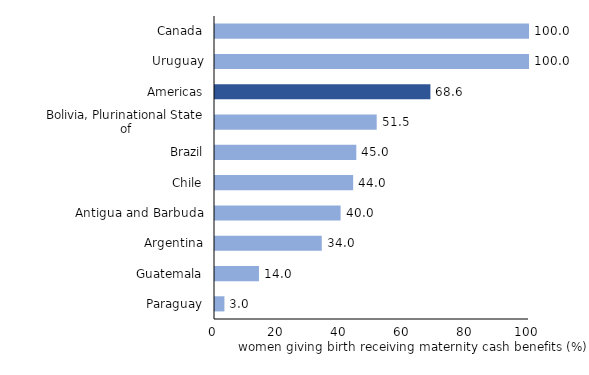
| Category | Beneficiaries of maternity benefits, % of women giving birth |
|---|---|
| Paraguay | 3 |
| Guatemala | 14 |
| Argentina | 34 |
| Antigua and Barbuda | 40 |
| Chile | 44 |
| Brazil | 45 |
| Bolivia, Plurinational State of | 51.5 |
| Americas | 68.6 |
| Uruguay | 100 |
| Canada | 100 |